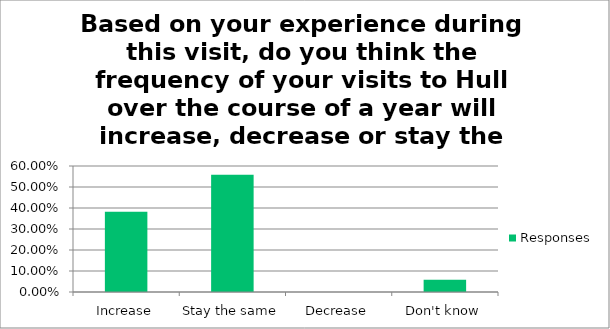
| Category | Responses |
|---|---|
| Increase | 0.382 |
| Stay the same | 0.559 |
| Decrease | 0 |
| Don't know | 0.059 |